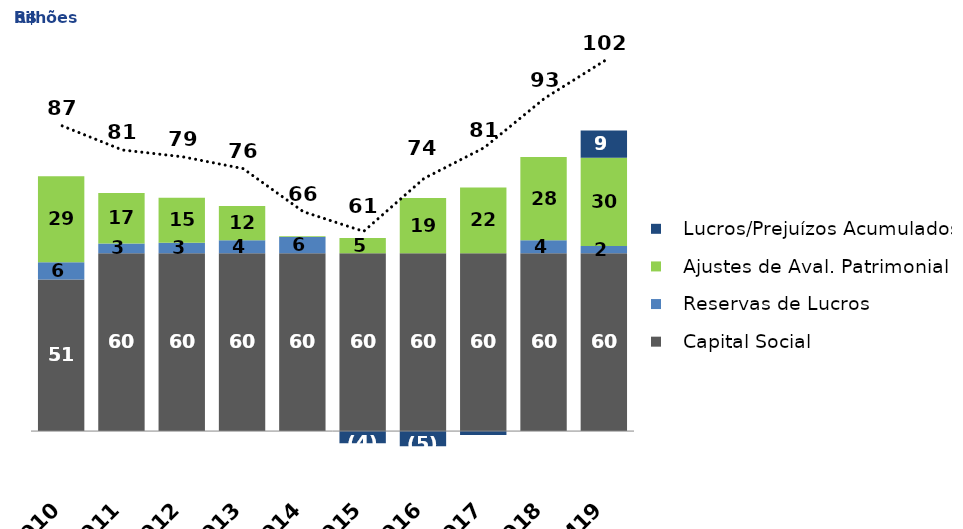
| Category |    Capital Social |    Reservas de Lucros |    Ajustes de Aval. Patrimonial |    Lucros/Prejuízos Acumulados |
|---|---|---|---|---|
| 2010 | 51.429 | 5.87 | 29.203 | 0 |
| 2011 | 60.376 | 3.298 | 17.096 | 0 |
| 2012 | 60.376 | 3.496 | 15.282 | 0 |
| 2013 | 60.345 | 4.38 | 11.628 | 0 |
| 2014 | 60.345 | 5.538 | 0.226 | 0 |
| 2015 | 60.345 | 0 | 5.208 | -4.119 |
| 2016 | 60.345 | 0 | 18.783 | -5.121 |
| 2017 | 60.345 | 0 | 22.329 | -1.343 |
| 2018 | 60.345 | 4.424 | 28.278 | 0 |
| 9M19 | 60.345 | 2.495 | 29.954 | 9.212 |